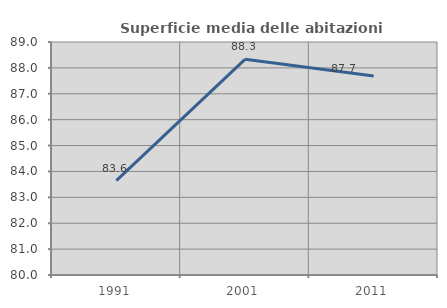
| Category | Superficie media delle abitazioni occupate |
|---|---|
| 1991.0 | 83.648 |
| 2001.0 | 88.33 |
| 2011.0 | 87.685 |